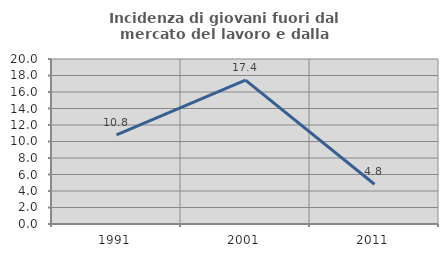
| Category | Incidenza di giovani fuori dal mercato del lavoro e dalla formazione  |
|---|---|
| 1991.0 | 10.798 |
| 2001.0 | 17.431 |
| 2011.0 | 4.819 |